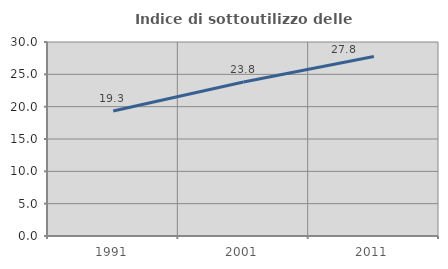
| Category | Indice di sottoutilizzo delle abitazioni  |
|---|---|
| 1991.0 | 19.34 |
| 2001.0 | 23.821 |
| 2011.0 | 27.752 |